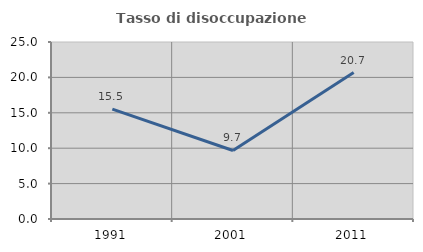
| Category | Tasso di disoccupazione giovanile  |
|---|---|
| 1991.0 | 15.517 |
| 2001.0 | 9.677 |
| 2011.0 | 20.69 |